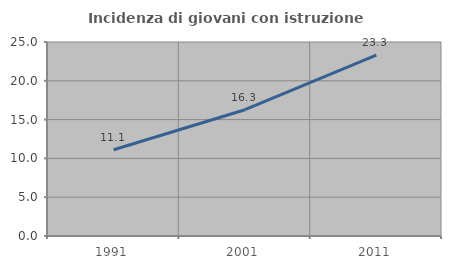
| Category | Incidenza di giovani con istruzione universitaria |
|---|---|
| 1991.0 | 11.111 |
| 2001.0 | 16.271 |
| 2011.0 | 23.318 |